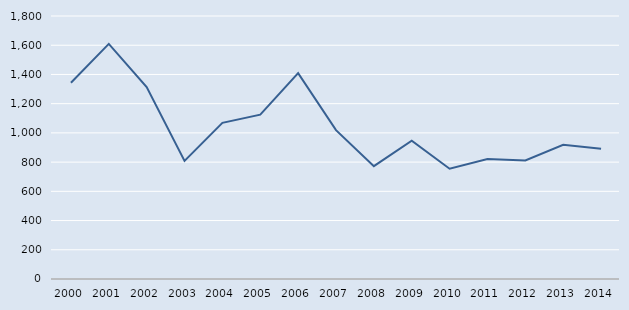
| Category | Series 0 |
|---|---|
| 2000.0 | 1343 |
| 2001.0 | 1609 |
| 2002.0 | 1313 |
| 2003.0 | 808 |
| 2004.0 | 1069 |
| 2005.0 | 1125 |
| 2006.0 | 1409 |
| 2007.0 | 1019 |
| 2008.0 | 772 |
| 2009.0 | 946 |
| 2010.0 | 755 |
| 2011.0 | 821 |
| 2012.0 | 811 |
| 2013.0 | 918 |
| 2014.0 | 892 |